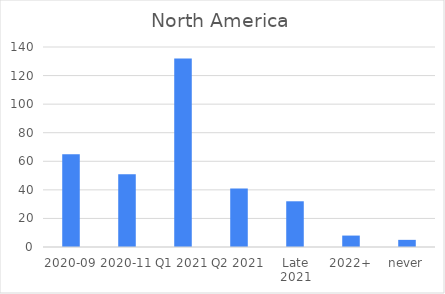
| Category | Series 0 |
|---|---|
| 2020-09 | 65 |
| 2020-11 | 51 |
| Q1 2021 | 132 |
| Q2 2021 | 41 |
| Late 2021 | 32 |
| 2022+ | 8 |
| never | 5 |